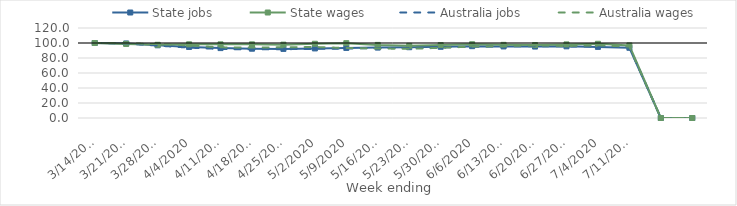
| Category | State jobs | State wages | Australia jobs | Australia wages |
|---|---|---|---|---|
| 14/03/2020 | 100 | 100 | 100 | 100 |
| 21/03/2020 | 99.383 | 98.756 | 99.345 | 99.743 |
| 28/03/2020 | 96.947 | 97.621 | 96.491 | 98.481 |
| 04/04/2020 | 94.688 | 98.255 | 93.819 | 96.778 |
| 11/04/2020 | 93.195 | 98.189 | 91.996 | 94.184 |
| 18/04/2020 | 92.381 | 98.193 | 91.451 | 94.032 |
| 25/04/2020 | 92.137 | 97.828 | 91.738 | 94.241 |
| 02/05/2020 | 92.766 | 98.98 | 92.109 | 94.689 |
| 09/05/2020 | 93.414 | 99.775 | 92.629 | 93.316 |
| 16/05/2020 | 93.858 | 97.474 | 93.158 | 92.67 |
| 23/05/2020 | 94.361 | 96.239 | 93.449 | 92.26 |
| 30/05/2020 | 94.955 | 97.215 | 94.006 | 93.552 |
| 06/06/2020 | 95.784 | 98.338 | 94.942 | 95.15 |
| 13/06/2020 | 95.432 | 97.528 | 95.443 | 95.811 |
| 20/06/2020 | 95.25 | 97.286 | 95.785 | 96.851 |
| 27/06/2020 | 95.58 | 98.126 | 95.571 | 95.974 |
| 04/07/2020 | 94.81 | 98.962 | 95.033 | 96.971 |
| 11/07/2020 | 93.626 | 96.806 | 94.423 | 95.167 |